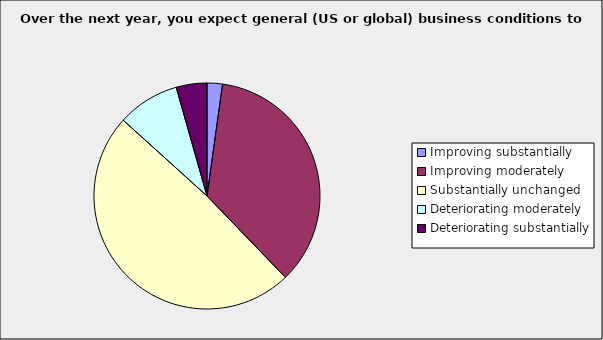
| Category | Series 0 |
|---|---|
| Improving substantially | 0.022 |
| Improving moderately | 0.356 |
| Substantially unchanged | 0.489 |
| Deteriorating moderately | 0.089 |
| Deteriorating substantially | 0.044 |